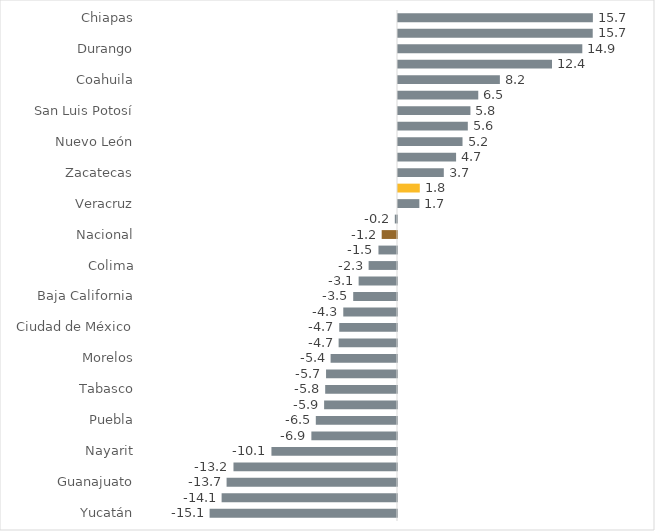
| Category | Series 0 |
|---|---|
| Yucatán | -15.113 |
| Hidalgo | -14.144 |
| Guanajuato | -13.743 |
| Tlaxcala | -13.187 |
| Nayarit | -10.126 |
| Querétaro | -6.906 |
| Puebla | -6.548 |
| Sonora | -5.878 |
| Tabasco | -5.792 |
| Oaxaca | -5.722 |
| Morelos | -5.355 |
| Michoacán | -4.708 |
| Ciudad de México | -4.658 |
| Aguascalientes | -4.332 |
| Baja California | -3.532 |
| Chihuahua | -3.095 |
| Colima | -2.289 |
| Estado de México | -1.495 |
| Nacional | -1.235 |
| Tamaulipas | -0.177 |
| Veracruz | 1.721 |
| Jalisco | 1.758 |
| Zacatecas | 3.694 |
| Quintana Roo | 4.684 |
| Nuevo León | 5.203 |
| Guerrero | 5.63 |
| San Luis Potosí | 5.84 |
| Baja California Sur | 6.473 |
| Coahuila | 8.216 |
| Campeche | 12.42 |
| Durango | 14.864 |
| Sinaloa | 15.704 |
| Chiapas | 15.716 |